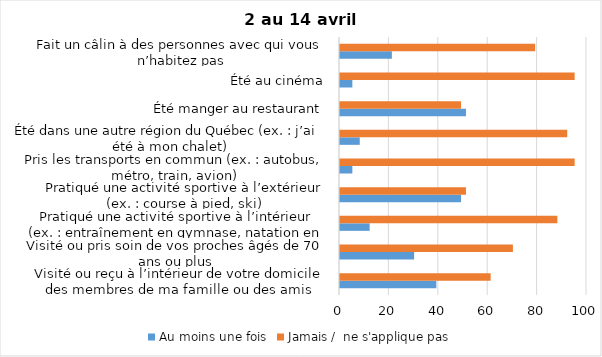
| Category | Au moins une fois | Jamais /  ne s'applique pas |
|---|---|---|
| Visité ou reçu à l’intérieur de votre domicile des membres de ma famille ou des amis | 39 | 61 |
| Visité ou pris soin de vos proches âgés de 70 ans ou plus | 30 | 70 |
| Pratiqué une activité sportive à l’intérieur (ex. : entraînement en gymnase, natation en piscine) | 12 | 88 |
| Pratiqué une activité sportive à l’extérieur (ex. : course à pied, ski) | 49 | 51 |
| Pris les transports en commun (ex. : autobus, métro, train, avion) | 5 | 95 |
| Été dans une autre région du Québec (ex. : j’ai été à mon chalet) | 8 | 92 |
| Été manger au restaurant | 51 | 49 |
| Été au cinéma | 5 | 95 |
| Fait un câlin à des personnes avec qui vous n’habitez pas | 21 | 79 |